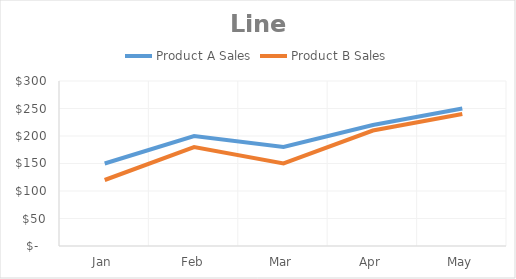
| Category | Product A Sales | Product B Sales |
|---|---|---|
| Jan | 150 | 120 |
| Feb | 200 | 180 |
| Mar | 180 | 150 |
| Apr | 220 | 210 |
| May | 250 | 240 |